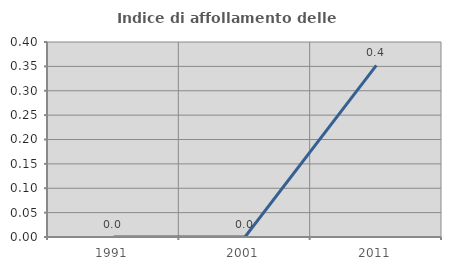
| Category | Indice di affollamento delle abitazioni  |
|---|---|
| 1991.0 | 0 |
| 2001.0 | 0 |
| 2011.0 | 0.352 |